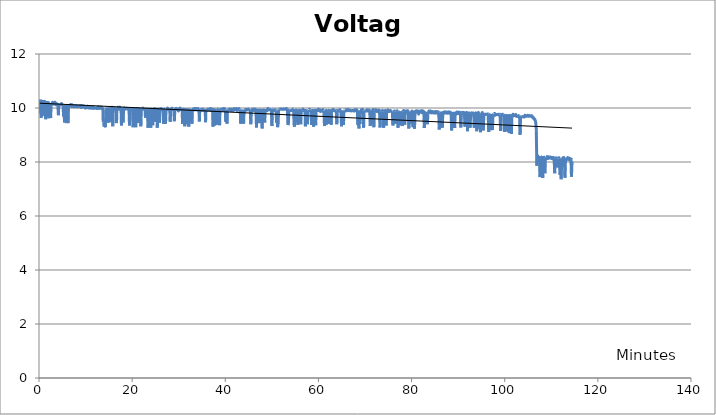
| Category | Voltage |
|---|---|
| 0.18333333333333332 | 9.8 |
| 0.2833333333333333 | 10.31 |
| 0.38333333333333336 | 10.25 |
| 0.48333333333333334 | 9.64 |
| 0.5833333333333334 | 10.26 |
| 0.7 | 9.72 |
| 0.7833333333333333 | 9.75 |
| 0.8833333333333333 | 10.24 |
| 0.9666666666666667 | 10.29 |
| 1.0666666666666667 | 10.25 |
| 1.15 | 10.21 |
| 1.2333333333333334 | 10.24 |
| 1.3333333333333333 | 10.22 |
| 1.4333333333333333 | 9.58 |
| 1.5333333333333334 | 10.26 |
| 1.6166666666666667 | 9.78 |
| 1.7 | 10.21 |
| 1.8 | 9.73 |
| 1.9 | 10.25 |
| 1.9833333333333334 | 9.66 |
| 2.066666666666667 | 10.2 |
| 2.1666666666666665 | 9.62 |
| 2.283333333333333 | 10.18 |
| 2.4 | 10.18 |
| 2.5 | 9.63 |
| 2.6166666666666667 | 10.16 |
| 2.7333333333333334 | 10.16 |
| 2.8333333333333335 | 10.17 |
| 2.95 | 10.21 |
| 3.066666666666667 | 10.14 |
| 3.1666666666666665 | 10.17 |
| 3.283333333333333 | 10.17 |
| 3.4 | 10.21 |
| 3.5 | 10.2 |
| 3.6166666666666667 | 10.12 |
| 3.7333333333333334 | 10.16 |
| 3.8333333333333335 | 10.14 |
| 3.95 | 10.14 |
| 4.05 | 10.12 |
| 4.166666666666667 | 9.73 |
| 4.25 | 10.14 |
| 4.35 | 10.16 |
| 4.433333333333334 | 10.13 |
| 4.533333333333333 | 10.13 |
| 4.65 | 10.12 |
| 4.733333333333333 | 10.12 |
| 4.833333333333333 | 10.17 |
| 4.916666666666667 | 10.12 |
| 5.0 | 10.14 |
| 5.083333333333333 | 10.12 |
| 5.183333333333334 | 10.12 |
| 5.266666666666667 | 9.69 |
| 5.35 | 10.11 |
| 5.433333333333334 | 9.6 |
| 5.533333333333333 | 9.46 |
| 5.616666666666666 | 10.11 |
| 5.7 | 10.09 |
| 5.8 | 10.11 |
| 5.883333333333334 | 9.44 |
| 5.966666666666667 | 10.11 |
| 6.05 | 9.64 |
| 6.15 | 10.09 |
| 6.233333333333333 | 9.44 |
| 6.333333333333333 | 10.05 |
| 6.416666666666667 | 10.14 |
| 6.5 | 10.08 |
| 6.6 | 10.09 |
| 6.683333333333334 | 10.07 |
| 6.766666666666667 | 10.13 |
| 6.85 | 10.08 |
| 6.95 | 10.08 |
| 7.033333333333333 | 10.07 |
| 7.116666666666666 | 10.12 |
| 7.216666666666667 | 10 |
| 7.3 | 10.11 |
| 7.383333333333334 | 10.05 |
| 7.483333333333333 | 10.08 |
| 7.566666666666666 | 10.04 |
| 7.666666666666667 | 10.08 |
| 7.75 | 10.07 |
| 7.866666666666666 | 10.05 |
| 7.983333333333333 | 10.05 |
| 8.083333333333334 | 10.09 |
| 8.183333333333334 | 10.07 |
| 8.283333333333333 | 10.04 |
| 8.366666666666667 | 10.05 |
| 8.466666666666667 | 10.05 |
| 8.55 | 10.07 |
| 8.633333333333333 | 10.08 |
| 8.716666666666667 | 10.05 |
| 8.816666666666666 | 10.09 |
| 8.9 | 10.05 |
| 9.0 | 10.02 |
| 9.083333333333334 | 10.09 |
| 9.166666666666666 | 10.04 |
| 9.25 | 10.03 |
| 9.35 | 10.08 |
| 9.433333333333334 | 10.04 |
| 9.516666666666667 | 10.04 |
| 9.616666666666667 | 10.08 |
| 9.7 | 10.04 |
| 9.783333333333333 | 10.03 |
| 9.883333333333333 | 10.03 |
| 9.966666666666667 | 9.99 |
| 10.066666666666666 | 10.03 |
| 10.15 | 10.03 |
| 10.233333333333333 | 10.03 |
| 10.316666666666666 | 10.02 |
| 10.416666666666666 | 10.07 |
| 10.5 | 10.02 |
| 10.6 | 10 |
| 10.683333333333334 | 10 |
| 10.766666666666667 | 10 |
| 10.866666666666667 | 10.04 |
| 10.95 | 10.04 |
| 11.033333333333333 | 10 |
| 11.116666666666667 | 10 |
| 11.216666666666667 | 9.99 |
| 11.3 | 10 |
| 11.383333333333333 | 9.99 |
| 11.483333333333333 | 10.04 |
| 11.566666666666666 | 10.03 |
| 11.65 | 10.04 |
| 11.75 | 9.99 |
| 11.833333333333334 | 9.99 |
| 11.916666666666666 | 9.99 |
| 12.016666666666667 | 10 |
| 12.1 | 10 |
| 12.2 | 9.99 |
| 12.283333333333333 | 9.99 |
| 12.366666666666667 | 9.98 |
| 12.45 | 9.98 |
| 12.55 | 9.99 |
| 12.633333333333333 | 10.04 |
| 12.716666666666667 | 10.04 |
| 12.8 | 10.03 |
| 12.9 | 9.98 |
| 12.983333333333333 | 10.02 |
| 13.066666666666666 | 10.03 |
| 13.166666666666666 | 9.99 |
| 13.25 | 10.03 |
| 13.333333333333334 | 10.03 |
| 13.433333333333334 | 9.98 |
| 13.516666666666667 | 10.03 |
| 13.6 | 10.03 |
| 13.7 | 10.03 |
| 13.783333333333333 | 9.47 |
| 13.883333333333333 | 9.47 |
| 13.966666666666667 | 9.31 |
| 14.066666666666666 | 9.33 |
| 14.166666666666666 | 9.33 |
| 14.266666666666667 | 9.29 |
| 14.35 | 9.95 |
| 14.433333333333334 | 9.98 |
| 14.516666666666667 | 9.96 |
| 14.616666666666667 | 10 |
| 14.7 | 10 |
| 14.783333333333333 | 9.45 |
| 14.866666666666667 | 9.98 |
| 14.966666666666667 | 9.96 |
| 15.05 | 9.98 |
| 15.133333333333333 | 9.99 |
| 15.233333333333333 | 9.98 |
| 15.316666666666666 | 9.47 |
| 15.4 | 9.94 |
| 15.5 | 9.95 |
| 15.583333333333334 | 9.96 |
| 15.666666666666666 | 10.03 |
| 15.766666666666667 | 9.99 |
| 15.85 | 9.32 |
| 15.933333333333334 | 9.94 |
| 16.033333333333335 | 9.94 |
| 16.116666666666667 | 9.96 |
| 16.2 | 10 |
| 16.3 | 9.94 |
| 16.383333333333333 | 9.96 |
| 16.466666666666665 | 9.96 |
| 16.55 | 9.99 |
| 16.65 | 9.44 |
| 16.733333333333334 | 9.96 |
| 16.816666666666666 | 9.95 |
| 16.9 | 9.99 |
| 17.0 | 10.03 |
| 17.083333333333332 | 9.96 |
| 17.166666666666668 | 9.96 |
| 17.266666666666666 | 9.96 |
| 17.35 | 10.03 |
| 17.45 | 9.98 |
| 17.533333333333335 | 9.96 |
| 17.616666666666667 | 9.95 |
| 17.7 | 9.35 |
| 17.8 | 9.95 |
| 17.883333333333333 | 9.96 |
| 17.966666666666665 | 10 |
| 18.066666666666666 | 9.46 |
| 18.15 | 9.96 |
| 18.233333333333334 | 9.98 |
| 18.333333333333332 | 10 |
| 18.416666666666668 | 9.96 |
| 18.516666666666666 | 9.96 |
| 18.633333333333333 | 9.98 |
| 18.716666666666665 | 9.98 |
| 18.816666666666666 | 9.99 |
| 18.9 | 9.98 |
| 18.983333333333334 | 9.96 |
| 19.1 | 9.98 |
| 19.216666666666665 | 9.96 |
| 19.316666666666666 | 10 |
| 19.433333333333334 | 9.35 |
| 19.55 | 9.95 |
| 19.65 | 9.95 |
| 19.766666666666666 | 9.96 |
| 19.883333333333333 | 9.96 |
| 19.983333333333334 | 9.95 |
| 20.1 | 10 |
| 20.2 | 9.29 |
| 20.316666666666666 | 9.95 |
| 20.433333333333334 | 9.96 |
| 20.533333333333335 | 9.96 |
| 20.65 | 10.02 |
| 20.766666666666666 | 9.29 |
| 20.866666666666667 | 9.95 |
| 20.983333333333334 | 9.95 |
| 21.083333333333332 | 9.96 |
| 21.2 | 10.02 |
| 21.316666666666666 | 9.44 |
| 21.416666666666668 | 9.96 |
| 21.533333333333335 | 9.96 |
| 21.65 | 9.95 |
| 21.75 | 10 |
| 21.866666666666667 | 9.32 |
| 21.983333333333334 | 9.96 |
| 22.083333333333332 | 9.98 |
| 22.2 | 9.96 |
| 22.316666666666666 | 10 |
| 22.416666666666668 | 9.96 |
| 22.533333333333335 | 9.96 |
| 22.65 | 9.98 |
| 22.75 | 10 |
| 22.866666666666667 | 9.64 |
| 22.983333333333334 | 9.94 |
| 23.083333333333332 | 9.96 |
| 23.2 | 9.96 |
| 23.316666666666666 | 9.94 |
| 23.416666666666668 | 9.27 |
| 23.533333333333335 | 9.95 |
| 23.65 | 9.95 |
| 23.75 | 9.95 |
| 23.866666666666667 | 9.99 |
| 23.983333333333334 | 9.27 |
| 24.083333333333332 | 9.95 |
| 24.183333333333334 | 9.95 |
| 24.3 | 10 |
| 24.416666666666668 | 9.36 |
| 24.516666666666666 | 9.95 |
| 24.633333333333333 | 9.96 |
| 24.733333333333334 | 9.96 |
| 24.85 | 10.02 |
| 24.966666666666665 | 9.49 |
| 25.066666666666666 | 9.95 |
| 25.183333333333334 | 9.96 |
| 25.3 | 9.99 |
| 25.4 | 9.27 |
| 25.516666666666666 | 9.96 |
| 25.616666666666667 | 9.96 |
| 25.733333333333334 | 9.99 |
| 25.85 | 9.45 |
| 25.95 | 9.95 |
| 26.066666666666666 | 9.95 |
| 26.183333333333334 | 9.98 |
| 26.283333333333335 | 9.94 |
| 26.4 | 9.95 |
| 26.516666666666666 | 9.95 |
| 26.616666666666667 | 9.99 |
| 26.733333333333334 | 9.41 |
| 26.833333333333332 | 9.95 |
| 26.95 | 9.95 |
| 27.066666666666666 | 9.96 |
| 27.166666666666668 | 9.42 |
| 27.283333333333335 | 9.94 |
| 27.4 | 9.94 |
| 27.5 | 9.95 |
| 27.616666666666667 | 10 |
| 27.733333333333334 | 9.94 |
| 27.833333333333332 | 9.95 |
| 27.95 | 9.95 |
| 28.066666666666666 | 9.99 |
| 28.166666666666668 | 9.49 |
| 28.283333333333335 | 9.96 |
| 28.4 | 9.96 |
| 28.5 | 9.98 |
| 28.616666666666667 | 9.99 |
| 28.733333333333334 | 9.96 |
| 28.833333333333332 | 9.94 |
| 28.95 | 9.95 |
| 29.066666666666666 | 9.51 |
| 29.166666666666668 | 9.94 |
| 29.283333333333335 | 9.95 |
| 29.4 | 9.99 |
| 29.5 | 9.95 |
| 29.616666666666667 | 9.95 |
| 29.733333333333334 | 9.96 |
| 29.833333333333332 | 9.95 |
| 29.95 | 9.89 |
| 30.05 | 9.96 |
| 30.166666666666668 | 9.96 |
| 30.283333333333335 | 10 |
| 30.383333333333333 | 9.95 |
| 30.5 | 9.94 |
| 30.616666666666667 | 9.94 |
| 30.716666666666665 | 9.99 |
| 30.833333333333332 | 9.41 |
| 30.933333333333334 | 9.95 |
| 31.05 | 9.95 |
| 31.166666666666668 | 9.99 |
| 31.283333333333335 | 9.32 |
| 31.383333333333333 | 9.94 |
| 31.5 | 9.94 |
| 31.616666666666667 | 9.96 |
| 31.716666666666665 | 9.4 |
| 31.833333333333332 | 9.93 |
| 31.95 | 9.94 |
| 32.05 | 9.98 |
| 32.166666666666664 | 9.31 |
| 32.28333333333333 | 9.93 |
| 32.38333333333333 | 9.93 |
| 32.5 | 9.93 |
| 32.583333333333336 | 9.49 |
| 32.666666666666664 | 9.93 |
| 32.75 | 9.96 |
| 32.85 | 9.42 |
| 32.93333333333333 | 9.91 |
| 33.016666666666666 | 9.94 |
| 33.11666666666667 | 9.96 |
| 33.2 | 9.93 |
| 33.28333333333333 | 9.93 |
| 33.36666666666667 | 9.98 |
| 33.45 | 9.94 |
| 33.55 | 9.94 |
| 33.63333333333333 | 9.94 |
| 33.71666666666667 | 9.98 |
| 33.81666666666667 | 9.96 |
| 33.9 | 9.93 |
| 33.983333333333334 | 9.93 |
| 34.083333333333336 | 9.94 |
| 34.166666666666664 | 9.94 |
| 34.25 | 9.98 |
| 34.35 | 9.98 |
| 34.43333333333333 | 9.5 |
| 34.516666666666666 | 9.94 |
| 34.61666666666667 | 9.93 |
| 34.7 | 9.9 |
| 34.78333333333333 | 9.93 |
| 34.88333333333333 | 9.93 |
| 34.96666666666667 | 9.93 |
| 35.06666666666667 | 9.93 |
| 35.15 | 9.96 |
| 35.233333333333334 | 9.91 |
| 35.31666666666667 | 9.93 |
| 35.416666666666664 | 9.93 |
| 35.5 | 9.93 |
| 35.583333333333336 | 9.93 |
| 35.68333333333333 | 9.96 |
| 35.766666666666666 | 9.47 |
| 35.85 | 9.94 |
| 35.95 | 9.91 |
| 36.03333333333333 | 9.93 |
| 36.13333333333333 | 9.91 |
| 36.21666666666667 | 9.93 |
| 36.3 | 9.96 |
| 36.38333333333333 | 9.93 |
| 36.46666666666667 | 9.93 |
| 36.56666666666667 | 9.94 |
| 36.65 | 9.93 |
| 36.733333333333334 | 9.96 |
| 36.833333333333336 | 9.98 |
| 36.916666666666664 | 9.91 |
| 37.0 | 9.91 |
| 37.1 | 9.93 |
| 37.18333333333333 | 9.96 |
| 37.28333333333333 | 9.96 |
| 37.36666666666667 | 9.31 |
| 37.45 | 9.91 |
| 37.53333333333333 | 9.94 |
| 37.63333333333333 | 9.98 |
| 37.71666666666667 | 9.35 |
| 37.8 | 9.93 |
| 37.9 | 9.93 |
| 37.983333333333334 | 9.91 |
| 38.06666666666667 | 9.94 |
| 38.166666666666664 | 9.38 |
| 38.25 | 9.93 |
| 38.333333333333336 | 9.93 |
| 38.43333333333333 | 9.96 |
| 38.516666666666666 | 9.93 |
| 38.6 | 9.93 |
| 38.68333333333333 | 9.95 |
| 38.78333333333333 | 9.36 |
| 38.86666666666667 | 9.91 |
| 38.96666666666667 | 9.93 |
| 39.05 | 9.95 |
| 39.13333333333333 | 9.91 |
| 39.233333333333334 | 9.91 |
| 39.3 | 9.95 |
| 39.4 | 9.93 |
| 39.483333333333334 | 9.93 |
| 39.56666666666667 | 9.98 |
| 39.666666666666664 | 9.91 |
| 39.75 | 9.94 |
| 39.833333333333336 | 9.98 |
| 39.93333333333333 | 9.94 |
| 40.016666666666666 | 9.93 |
| 40.1 | 9.49 |
| 40.2 | 9.93 |
| 40.28333333333333 | 9.93 |
| 40.36666666666667 | 9.42 |
| 40.46666666666667 | 9.94 |
| 40.55 | 9.94 |
| 40.63333333333333 | 9.93 |
| 40.733333333333334 | 9.93 |
| 40.81666666666667 | 9.96 |
| 40.9 | 9.93 |
| 41.0 | 9.93 |
| 41.083333333333336 | 9.91 |
| 41.166666666666664 | 9.91 |
| 41.266666666666666 | 9.96 |
| 41.35 | 9.91 |
| 41.43333333333333 | 9.95 |
| 41.53333333333333 | 9.93 |
| 41.61666666666667 | 9.91 |
| 41.7 | 9.91 |
| 41.8 | 9.93 |
| 41.88333333333333 | 9.98 |
| 41.96666666666667 | 9.93 |
| 42.05 | 9.96 |
| 42.15 | 9.94 |
| 42.233333333333334 | 9.96 |
| 42.333333333333336 | 9.94 |
| 42.416666666666664 | 9.98 |
| 42.5 | 9.91 |
| 42.6 | 9.96 |
| 42.68333333333333 | 9.93 |
| 42.766666666666666 | 9.96 |
| 42.85 | 9.93 |
| 42.95 | 9.98 |
| 43.03333333333333 | 9.93 |
| 43.11666666666667 | 9.9 |
| 43.21666666666667 | 9.93 |
| 43.3 | 9.42 |
| 43.4 | 9.93 |
| 43.483333333333334 | 9.9 |
| 43.6 | 9.93 |
| 43.71666666666667 | 9.45 |
| 43.81666666666667 | 9.91 |
| 43.93333333333333 | 9.42 |
| 44.03333333333333 | 9.93 |
| 44.15 | 9.85 |
| 44.266666666666666 | 9.93 |
| 44.36666666666667 | 9.91 |
| 44.483333333333334 | 9.95 |
| 44.6 | 9.93 |
| 44.7 | 9.94 |
| 44.81666666666667 | 9.93 |
| 44.93333333333333 | 9.96 |
| 45.03333333333333 | 9.94 |
| 45.15 | 9.93 |
| 45.266666666666666 | 9.93 |
| 45.36666666666667 | 9.94 |
| 45.483333333333334 | 9.4 |
| 45.6 | 9.93 |
| 45.7 | 9.91 |
| 45.81666666666667 | 9.96 |
| 45.93333333333333 | 9.91 |
| 46.03333333333333 | 9.91 |
| 46.15 | 9.96 |
| 46.266666666666666 | 9.93 |
| 46.36666666666667 | 9.91 |
| 46.483333333333334 | 9.96 |
| 46.583333333333336 | 9.91 |
| 46.7 | 9.28 |
| 46.81666666666667 | 9.96 |
| 46.916666666666664 | 9.93 |
| 47.03333333333333 | 9.44 |
| 47.15 | 9.96 |
| 47.25 | 9.93 |
| 47.36666666666667 | 9.91 |
| 47.46666666666667 | 9.44 |
| 47.583333333333336 | 9.96 |
| 47.7 | 9.93 |
| 47.8 | 9.91 |
| 47.916666666666664 | 9.24 |
| 48.03333333333333 | 9.95 |
| 48.13333333333333 | 9.91 |
| 48.233333333333334 | 9.93 |
| 48.35 | 9.91 |
| 48.46666666666667 | 9.46 |
| 48.56666666666667 | 9.96 |
| 48.68333333333333 | 9.91 |
| 48.8 | 9.91 |
| 48.9 | 9.9 |
| 49.016666666666666 | 9.91 |
| 49.13333333333333 | 9.98 |
| 49.233333333333334 | 9.96 |
| 49.35 | 9.94 |
| 49.46666666666667 | 9.94 |
| 49.56666666666667 | 9.93 |
| 49.68333333333333 | 9.94 |
| 49.8 | 9.91 |
| 49.9 | 9.91 |
| 50.016666666666666 | 9.33 |
| 50.13333333333333 | 9.96 |
| 50.233333333333334 | 9.96 |
| 50.35 | 9.94 |
| 50.46666666666667 | 9.93 |
| 50.56666666666667 | 9.91 |
| 50.68333333333333 | 9.93 |
| 50.78333333333333 | 9.93 |
| 50.9 | 9.91 |
| 51.016666666666666 | 9.46 |
| 51.11666666666667 | 9.9 |
| 51.233333333333334 | 9.29 |
| 51.35 | 9.41 |
| 51.45 | 9.94 |
| 51.56666666666667 | 9.96 |
| 51.666666666666664 | 9.96 |
| 51.78333333333333 | 9.96 |
| 51.9 | 9.96 |
| 52.0 | 9.95 |
| 52.11666666666667 | 9.96 |
| 52.21666666666667 | 9.96 |
| 52.333333333333336 | 9.95 |
| 52.45 | 9.96 |
| 52.55 | 9.96 |
| 52.666666666666664 | 9.95 |
| 52.78333333333333 | 9.96 |
| 52.88333333333333 | 9.96 |
| 53.0 | 9.95 |
| 53.11666666666667 | 9.98 |
| 53.21666666666667 | 9.98 |
| 53.333333333333336 | 9.98 |
| 53.45 | 9.37 |
| 53.55 | 9.42 |
| 53.666666666666664 | 9.91 |
| 53.78333333333333 | 9.91 |
| 53.88333333333333 | 9.91 |
| 54.0 | 9.91 |
| 54.11666666666667 | 9.91 |
| 54.21666666666667 | 9.91 |
| 54.333333333333336 | 9.91 |
| 54.43333333333333 | 9.93 |
| 54.55 | 9.96 |
| 54.666666666666664 | 9.96 |
| 54.766666666666666 | 9.36 |
| 54.88333333333333 | 9.31 |
| 54.983333333333334 | 9.91 |
| 55.1 | 9.91 |
| 55.21666666666667 | 9.93 |
| 55.31666666666667 | 9.91 |
| 55.43333333333333 | 9.95 |
| 55.55 | 9.38 |
| 55.65 | 9.46 |
| 55.766666666666666 | 9.91 |
| 55.86666666666667 | 9.91 |
| 55.983333333333334 | 9.93 |
| 56.1 | 9.96 |
| 56.2 | 9.4 |
| 56.31666666666667 | 9.91 |
| 56.43333333333333 | 9.93 |
| 56.53333333333333 | 9.93 |
| 56.65 | 9.96 |
| 56.766666666666666 | 9.91 |
| 56.86666666666667 | 9.91 |
| 56.983333333333334 | 9.93 |
| 57.1 | 9.96 |
| 57.2 | 9.32 |
| 57.31666666666667 | 9.91 |
| 57.43333333333333 | 9.91 |
| 57.53333333333333 | 9.91 |
| 57.65 | 9.4 |
| 57.766666666666666 | 9.9 |
| 57.86666666666667 | 9.93 |
| 57.983333333333334 | 9.91 |
| 58.083333333333336 | 9.96 |
| 58.2 | 9.91 |
| 58.31666666666667 | 9.91 |
| 58.416666666666664 | 9.93 |
| 58.53333333333333 | 9.37 |
| 58.63333333333333 | 9.89 |
| 58.75 | 9.91 |
| 58.86666666666667 | 9.95 |
| 58.96666666666667 | 9.31 |
| 59.083333333333336 | 9.9 |
| 59.18333333333333 | 9.91 |
| 59.3 | 9.96 |
| 59.416666666666664 | 9.36 |
| 59.516666666666666 | 9.91 |
| 59.63333333333333 | 9.96 |
| 59.75 | 9.91 |
| 59.85 | 9.91 |
| 59.96666666666667 | 9.96 |
| 60.083333333333336 | 9.91 |
| 60.18333333333333 | 9.93 |
| 60.3 | 9.93 |
| 60.416666666666664 | 9.87 |
| 60.516666666666666 | 9.91 |
| 60.63333333333333 | 9.9 |
| 60.75 | 9.9 |
| 60.85 | 9.91 |
| 60.96666666666667 | 9.94 |
| 61.083333333333336 | 9.87 |
| 61.18333333333333 | 9.9 |
| 61.3 | 9.33 |
| 61.4 | 9.91 |
| 61.516666666666666 | 9.91 |
| 61.63333333333333 | 9.37 |
| 61.733333333333334 | 9.91 |
| 61.85 | 9.95 |
| 61.95 | 9.89 |
| 62.06666666666667 | 9.91 |
| 62.18333333333333 | 9.42 |
| 62.28333333333333 | 9.91 |
| 62.4 | 9.95 |
| 62.5 | 9.9 |
| 62.61666666666667 | 9.91 |
| 62.733333333333334 | 9.38 |
| 62.833333333333336 | 9.91 |
| 62.95 | 9.95 |
| 63.06666666666667 | 9.9 |
| 63.166666666666664 | 9.95 |
| 63.28333333333333 | 9.91 |
| 63.4 | 9.9 |
| 63.5 | 9.9 |
| 63.61666666666667 | 9.9 |
| 63.733333333333334 | 9.9 |
| 63.833333333333336 | 9.9 |
| 63.95 | 9.4 |
| 64.06666666666666 | 9.91 |
| 64.16666666666667 | 9.95 |
| 64.28333333333333 | 9.91 |
| 64.38333333333334 | 9.9 |
| 64.5 | 9.89 |
| 64.61666666666666 | 9.94 |
| 64.71666666666667 | 9.87 |
| 64.83333333333333 | 9.91 |
| 64.95 | 9.32 |
| 65.05 | 9.9 |
| 65.16666666666667 | 9.45 |
| 65.26666666666667 | 9.9 |
| 65.38333333333334 | 9.37 |
| 65.48333333333333 | 9.9 |
| 65.6 | 9.91 |
| 65.71666666666667 | 9.9 |
| 65.81666666666666 | 9.94 |
| 65.93333333333334 | 9.9 |
| 66.03333333333333 | 9.93 |
| 66.15 | 9.9 |
| 66.26666666666667 | 9.95 |
| 66.38333333333334 | 9.91 |
| 66.48333333333333 | 9.9 |
| 66.6 | 9.91 |
| 66.71666666666667 | 9.93 |
| 66.81666666666666 | 9.9 |
| 66.93333333333334 | 9.9 |
| 67.05 | 9.89 |
| 67.16666666666667 | 9.9 |
| 67.26666666666667 | 9.91 |
| 67.36666666666666 | 9.9 |
| 67.48333333333333 | 9.91 |
| 67.6 | 9.89 |
| 67.7 | 9.89 |
| 67.81666666666666 | 9.94 |
| 67.91666666666667 | 9.9 |
| 68.03333333333333 | 9.94 |
| 68.15 | 9.89 |
| 68.25 | 9.93 |
| 68.36666666666666 | 9.86 |
| 68.48333333333333 | 9.37 |
| 68.58333333333333 | 9.9 |
| 68.7 | 9.24 |
| 68.8 | 9.9 |
| 68.91666666666667 | 9.41 |
| 69.03333333333333 | 9.9 |
| 69.13333333333334 | 9.89 |
| 69.25 | 9.94 |
| 69.36666666666666 | 9.87 |
| 69.46666666666667 | 9.94 |
| 69.58333333333333 | 9.9 |
| 69.7 | 9.27 |
| 69.8 | 9.89 |
| 69.91666666666667 | 9.89 |
| 70.03333333333333 | 9.89 |
| 70.13333333333334 | 9.9 |
| 70.25 | 9.89 |
| 70.36666666666666 | 9.89 |
| 70.46666666666667 | 9.94 |
| 70.58333333333333 | 9.89 |
| 70.68333333333334 | 9.93 |
| 70.8 | 9.89 |
| 70.91666666666667 | 9.93 |
| 71.01666666666667 | 9.89 |
| 71.13333333333334 | 9.33 |
| 71.23333333333333 | 9.9 |
| 71.35 | 9.41 |
| 71.46666666666667 | 9.9 |
| 71.56666666666666 | 9.87 |
| 71.68333333333334 | 9.94 |
| 71.78333333333333 | 9.89 |
| 71.9 | 9.29 |
| 72.01666666666667 | 9.89 |
| 72.11666666666666 | 9.9 |
| 72.23333333333333 | 9.94 |
| 72.35 | 9.89 |
| 72.45 | 9.93 |
| 72.56666666666666 | 9.87 |
| 72.68333333333334 | 9.89 |
| 72.78333333333333 | 9.87 |
| 72.9 | 9.87 |
| 73.01666666666667 | 9.93 |
| 73.11666666666666 | 9.87 |
| 73.23333333333333 | 9.28 |
| 73.35 | 9.86 |
| 73.45 | 9.87 |
| 73.56666666666666 | 9.89 |
| 73.66666666666667 | 9.89 |
| 73.78333333333333 | 9.91 |
| 73.9 | 9.87 |
| 74.0 | 9.27 |
| 74.11666666666666 | 9.87 |
| 74.21666666666667 | 9.87 |
| 74.33333333333333 | 9.91 |
| 74.45 | 9.87 |
| 74.55 | 9.35 |
| 74.66666666666667 | 9.89 |
| 74.76666666666667 | 9.87 |
| 74.88333333333334 | 9.93 |
| 75.0 | 9.89 |
| 75.1 | 9.87 |
| 75.21666666666667 | 9.87 |
| 75.33333333333333 | 9.89 |
| 75.43333333333334 | 9.91 |
| 75.55 | 9.89 |
| 75.66666666666667 | 9.87 |
| 75.76666666666667 | 9.87 |
| 75.88333333333334 | 9.87 |
| 76.0 | 9.35 |
| 76.1 | 9.86 |
| 76.21666666666667 | 9.86 |
| 76.33333333333333 | 9.89 |
| 76.43333333333334 | 9.87 |
| 76.55 | 9.41 |
| 76.65 | 9.86 |
| 76.76666666666667 | 9.86 |
| 76.88333333333334 | 9.9 |
| 76.98333333333333 | 9.87 |
| 77.1 | 9.27 |
| 77.2 | 9.87 |
| 77.31666666666666 | 9.86 |
| 77.43333333333334 | 9.41 |
| 77.53333333333333 | 9.87 |
| 77.65 | 9.36 |
| 77.75 | 9.87 |
| 77.86666666666666 | 9.86 |
| 77.98333333333333 | 9.33 |
| 78.08333333333333 | 9.87 |
| 78.2 | 9.87 |
| 78.31666666666666 | 9.91 |
| 78.41666666666667 | 9.86 |
| 78.53333333333333 | 9.38 |
| 78.65 | 9.87 |
| 78.75 | 9.85 |
| 78.86666666666666 | 9.9 |
| 78.98333333333333 | 9.85 |
| 79.08333333333333 | 9.86 |
| 79.2 | 9.9 |
| 79.3 | 9.84 |
| 79.41666666666667 | 9.24 |
| 79.53333333333333 | 9.86 |
| 79.63333333333334 | 9.82 |
| 79.75 | 9.42 |
| 79.86666666666666 | 9.85 |
| 79.96666666666667 | 9.85 |
| 80.08333333333333 | 9.89 |
| 80.18333333333334 | 9.85 |
| 80.3 | 9.29 |
| 80.41666666666667 | 9.9 |
| 80.51666666666667 | 9.86 |
| 80.63333333333334 | 9.23 |
| 80.73333333333333 | 9.85 |
| 80.85 | 9.85 |
| 80.96666666666667 | 9.9 |
| 81.06666666666666 | 9.85 |
| 81.18333333333334 | 9.85 |
| 81.3 | 9.9 |
| 81.4 | 9.85 |
| 81.51666666666667 | 9.77 |
| 81.63333333333334 | 9.85 |
| 81.73333333333333 | 9.84 |
| 81.85 | 9.89 |
| 81.96666666666667 | 9.85 |
| 82.06666666666666 | 9.85 |
| 82.18333333333334 | 9.9 |
| 82.28333333333333 | 9.82 |
| 82.4 | 9.85 |
| 82.51666666666667 | 9.89 |
| 82.63333333333334 | 9.84 |
| 82.73333333333333 | 9.26 |
| 82.85 | 9.86 |
| 82.95 | 9.84 |
| 83.06666666666666 | 9.72 |
| 83.18333333333334 | 9.84 |
| 83.28333333333333 | 9.78 |
| 83.4 | 9.4 |
| 83.51666666666667 | 9.85 |
| 83.61666666666666 | 9.81 |
| 83.73333333333333 | 9.89 |
| 83.83333333333333 | 9.84 |
| 83.95 | 9.84 |
| 84.06666666666666 | 9.89 |
| 84.16666666666667 | 9.85 |
| 84.28333333333333 | 9.82 |
| 84.4 | 9.87 |
| 84.51666666666667 | 9.84 |
| 84.61666666666666 | 9.82 |
| 84.73333333333333 | 9.86 |
| 84.85 | 9.82 |
| 84.95 | 9.82 |
| 85.06666666666666 | 9.87 |
| 85.18333333333334 | 9.81 |
| 85.28333333333333 | 9.84 |
| 85.4 | 9.87 |
| 85.5 | 9.82 |
| 85.61666666666666 | 9.82 |
| 85.73333333333333 | 9.86 |
| 85.83333333333333 | 9.82 |
| 85.95 | 9.2 |
| 86.05 | 9.82 |
| 86.16666666666667 | 9.81 |
| 86.26666666666667 | 9.29 |
| 86.38333333333334 | 9.86 |
| 86.5 | 9.82 |
| 86.6 | 9.27 |
| 86.71666666666667 | 9.86 |
| 86.81666666666666 | 9.81 |
| 86.93333333333334 | 9.81 |
| 87.05 | 9.86 |
| 87.15 | 9.82 |
| 87.26666666666667 | 9.82 |
| 87.38333333333334 | 9.86 |
| 87.48333333333333 | 9.82 |
| 87.6 | 9.81 |
| 87.71666666666667 | 9.85 |
| 87.81666666666666 | 9.81 |
| 87.93333333333334 | 9.82 |
| 88.05 | 9.86 |
| 88.15 | 9.81 |
| 88.26666666666667 | 9.81 |
| 88.36666666666666 | 9.84 |
| 88.48333333333333 | 9.8 |
| 88.6 | 9.17 |
| 88.7 | 9.85 |
| 88.81666666666666 | 9.81 |
| 88.91666666666667 | 9.28 |
| 89.03333333333333 | 9.84 |
| 89.15 | 9.81 |
| 89.25 | 9.26 |
| 89.36666666666666 | 9.85 |
| 89.46666666666667 | 9.81 |
| 89.58333333333333 | 9.77 |
| 89.7 | 9.85 |
| 89.8 | 9.81 |
| 89.91666666666667 | 9.8 |
| 90.03333333333333 | 9.85 |
| 90.13333333333334 | 9.8 |
| 90.25 | 9.8 |
| 90.36666666666666 | 9.84 |
| 90.46666666666667 | 9.78 |
| 90.58333333333333 | 9.28 |
| 90.7 | 9.78 |
| 90.8 | 9.81 |
| 90.91666666666667 | 9.84 |
| 91.03333333333333 | 9.78 |
| 91.13333333333334 | 9.78 |
| 91.25 | 9.84 |
| 91.35 | 9.78 |
| 91.46666666666667 | 9.31 |
| 91.58333333333333 | 9.8 |
| 91.68333333333334 | 9.77 |
| 91.8 | 9.84 |
| 91.9 | 9.78 |
| 92.01666666666667 | 9.14 |
| 92.13333333333334 | 9.78 |
| 92.23333333333333 | 9.77 |
| 92.35 | 9.82 |
| 92.45 | 9.78 |
| 92.56666666666666 | 9.27 |
| 92.68333333333334 | 9.78 |
| 92.78333333333333 | 9.78 |
| 92.9 | 9.82 |
| 93.01666666666667 | 9.8 |
| 93.11666666666666 | 9.77 |
| 93.23333333333333 | 9.82 |
| 93.35 | 9.78 |
| 93.45 | 9.27 |
| 93.56666666666666 | 9.77 |
| 93.68333333333334 | 9.77 |
| 93.78333333333333 | 9.82 |
| 93.9 | 9.76 |
| 94.0 | 9.14 |
| 94.11666666666666 | 9.78 |
| 94.23333333333333 | 9.78 |
| 94.35 | 9.84 |
| 94.46666666666667 | 9.78 |
| 94.58333333333333 | 9.23 |
| 94.7 | 9.78 |
| 94.81666666666666 | 9.1 |
| 94.93333333333334 | 9.8 |
| 95.05 | 9.77 |
| 95.16666666666667 | 9.84 |
| 95.28333333333333 | 9.77 |
| 95.4 | 9.17 |
| 95.51666666666667 | 9.78 |
| 95.63333333333334 | 9.77 |
| 95.75 | 9.77 |
| 95.86666666666666 | 9.76 |
| 95.98333333333333 | 9.77 |
| 96.1 | 9.77 |
| 96.21666666666667 | 9.77 |
| 96.33333333333333 | 9.78 |
| 96.45 | 9.77 |
| 96.56666666666666 | 9.11 |
| 96.68333333333334 | 9.78 |
| 96.78333333333333 | 9.8 |
| 96.9 | 9.75 |
| 97.01666666666667 | 9.77 |
| 97.13333333333334 | 9.18 |
| 97.25 | 9.77 |
| 97.36666666666666 | 9.19 |
| 97.48333333333333 | 9.76 |
| 97.6 | 9.78 |
| 97.71666666666667 | 9.76 |
| 97.83333333333333 | 9.8 |
| 97.95 | 9.73 |
| 98.06666666666666 | 9.76 |
| 98.18333333333334 | 9.75 |
| 98.3 | 9.76 |
| 98.41666666666667 | 9.76 |
| 98.53333333333333 | 9.76 |
| 98.65 | 9.76 |
| 98.76666666666667 | 9.77 |
| 98.88333333333334 | 9.73 |
| 99.0 | 9.75 |
| 99.11666666666666 | 9.15 |
| 99.23333333333333 | 9.76 |
| 99.35 | 9.8 |
| 99.46666666666667 | 9.75 |
| 99.58333333333333 | 9.77 |
| 99.7 | 9.73 |
| 99.81666666666666 | 9.75 |
| 99.93333333333334 | 9.11 |
| 100.03333333333333 | 9.72 |
| 100.15 | 9.76 |
| 100.26666666666667 | 9.46 |
| 100.38333333333334 | 9.73 |
| 100.5 | 9.75 |
| 100.61666666666666 | 9.13 |
| 100.73333333333333 | 9.71 |
| 100.85 | 9.76 |
| 100.96666666666667 | 9.07 |
| 101.08333333333333 | 9.72 |
| 101.2 | 9.72 |
| 101.31666666666666 | 9.76 |
| 101.43333333333334 | 9.04 |
| 101.55 | 9.73 |
| 101.66666666666667 | 9.72 |
| 101.78333333333333 | 9.77 |
| 101.9 | 9.71 |
| 102.01666666666667 | 9.72 |
| 102.13333333333334 | 9.72 |
| 102.25 | 9.72 |
| 102.36666666666666 | 9.76 |
| 102.48333333333333 | 9.69 |
| 102.6 | 9.71 |
| 102.71666666666667 | 9.69 |
| 102.83333333333333 | 9.69 |
| 102.95 | 9.69 |
| 103.06666666666666 | 9.72 |
| 103.18333333333334 | 9.72 |
| 103.3 | 9.01 |
| 103.4 | 9.68 |
| 103.53333333333333 | 9.68 |
| 103.63333333333334 | 9.68 |
| 103.75 | 9.67 |
| 103.86666666666666 | 9.68 |
| 103.98333333333333 | 9.68 |
| 104.1 | 9.67 |
| 104.21666666666667 | 9.67 |
| 104.33333333333333 | 9.73 |
| 104.45 | 9.71 |
| 104.56666666666666 | 9.71 |
| 104.68333333333334 | 9.69 |
| 104.8 | 9.71 |
| 104.91666666666667 | 9.73 |
| 105.03333333333333 | 9.71 |
| 105.15 | 9.69 |
| 105.26666666666667 | 9.72 |
| 105.38333333333334 | 9.71 |
| 105.5 | 9.71 |
| 105.61666666666666 | 9.69 |
| 105.73333333333333 | 9.71 |
| 105.85 | 9.71 |
| 105.96666666666667 | 9.66 |
| 106.08333333333333 | 9.63 |
| 106.2 | 9.64 |
| 106.31666666666666 | 9.59 |
| 106.43333333333334 | 9.59 |
| 106.55 | 9.54 |
| 106.66666666666667 | 9.45 |
| 106.78333333333333 | 9.18 |
| 106.9 | 7.86 |
| 107.01666666666667 | 8.26 |
| 107.13333333333334 | 8.21 |
| 107.25 | 8.17 |
| 107.35 | 8.17 |
| 107.46666666666667 | 8.15 |
| 107.58333333333333 | 7.44 |
| 107.7 | 8.21 |
| 107.81666666666666 | 8.2 |
| 107.93333333333334 | 8.16 |
| 108.05 | 8.15 |
| 108.16666666666667 | 7.41 |
| 108.28333333333333 | 8.22 |
| 108.4 | 8.16 |
| 108.51666666666667 | 8.08 |
| 108.63333333333334 | 7.58 |
| 108.75 | 8.16 |
| 108.86666666666666 | 8.12 |
| 108.98333333333333 | 8.13 |
| 109.1 | 8.2 |
| 109.21666666666667 | 8.16 |
| 109.33333333333333 | 8.13 |
| 109.45 | 8.19 |
| 109.56666666666666 | 8.15 |
| 109.68333333333334 | 8.16 |
| 109.8 | 8.19 |
| 109.91666666666667 | 8.16 |
| 110.03333333333333 | 8.13 |
| 110.15 | 8.17 |
| 110.26666666666667 | 8.15 |
| 110.38333333333334 | 8.11 |
| 110.5 | 8.17 |
| 110.61666666666666 | 8.12 |
| 110.73333333333333 | 7.58 |
| 110.85 | 8.12 |
| 110.96666666666667 | 8.12 |
| 111.08333333333333 | 8.16 |
| 111.2 | 8.12 |
| 111.31666666666666 | 7.8 |
| 111.43333333333334 | 8.12 |
| 111.53333333333333 | 8.13 |
| 111.65 | 8.16 |
| 111.76666666666667 | 8.1 |
| 111.88333333333334 | 7.53 |
| 112.0 | 8.11 |
| 112.11666666666666 | 7.36 |
| 112.23333333333333 | 8.11 |
| 112.35 | 8.08 |
| 112.46666666666667 | 8.15 |
| 112.58333333333333 | 8.12 |
| 112.7 | 8.17 |
| 112.81666666666666 | 8.1 |
| 112.93333333333334 | 7.42 |
| 113.05 | 8.11 |
| 113.16666666666667 | 8.07 |
| 113.28333333333333 | 8.11 |
| 113.4 | 8.1 |
| 113.51666666666667 | 8.17 |
| 113.63333333333334 | 8.1 |
| 113.75 | 8.15 |
| 113.86666666666666 | 8.08 |
| 113.98333333333333 | 8.13 |
| 114.1 | 8.1 |
| 114.21666666666667 | 8.16 |
| 114.33333333333333 | 7.45 |
| 114.45 | 8.02 |